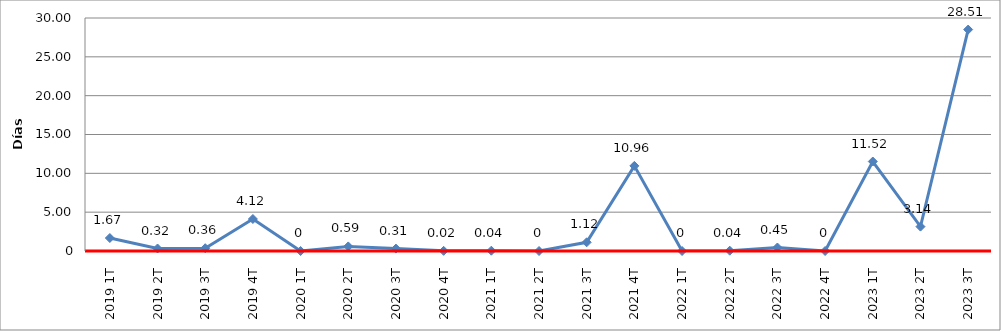
| Category | Total |
|---|---|
| 2019 1T | 1.67 |
| 2019 2T | 0.32 |
| 2019 3T | 0.36 |
| 2019 4T | 4.12 |
| 2020 1T | 0 |
| 2020 2T | 0.59 |
| 2020 3T | 0.31 |
| 2020 4T | 0.02 |
| 2021 1T | 0.04 |
| 2021 2T | 0 |
| 2021 3T | 1.12 |
| 2021 4T | 10.96 |
| 2022 1T | 0 |
| 2022 2T | 0.04 |
| 2022 3T | 0.45 |
| 2022 4T | 0 |
| 2023 1T | 11.52 |
| 2023 2T | 3.14 |
| 2023 3T | 28.51 |